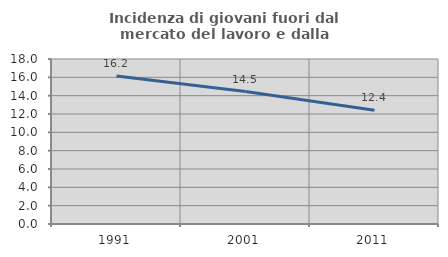
| Category | Incidenza di giovani fuori dal mercato del lavoro e dalla formazione  |
|---|---|
| 1991.0 | 16.151 |
| 2001.0 | 14.451 |
| 2011.0 | 12.4 |